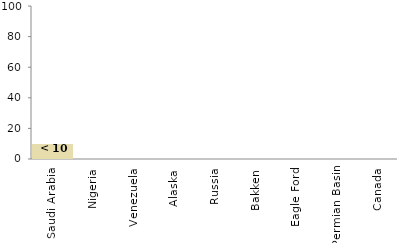
| Category | Series 0 |
|---|---|
| Saudi Arabia | 0 |
| Nigeria | 0 |
| Venezuela | 0 |
| Alaska | 0 |
| Russia | 0 |
| Bakken | 0 |
| Eagle Ford | 0 |
| Permian Basin | 0 |
| Canada | 0 |